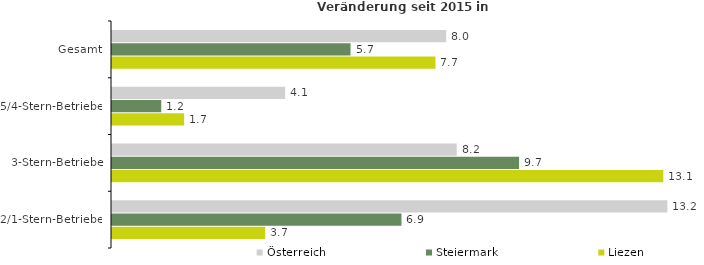
| Category | Österreich | Steiermark | Liezen |
|---|---|---|---|
| Gesamt | 7.97 | 5.689 | 7.715 |
| 5/4-Stern-Betriebe | 4.13 | 1.174 | 1.72 |
| 3-Stern-Betriebe | 8.22 | 9.709 | 13.149 |
| 2/1-Stern-Betriebe | 13.246 | 6.904 | 3.653 |